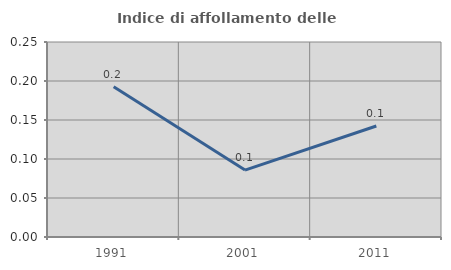
| Category | Indice di affollamento delle abitazioni  |
|---|---|
| 1991.0 | 0.192 |
| 2001.0 | 0.086 |
| 2011.0 | 0.142 |